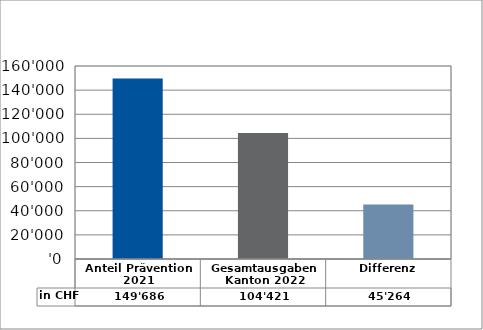
| Category | in CHF |
|---|---|
| Anteil Prävention 2021

 | 149685.6 |
| Gesamtausgaben Kanton 2022
 | 104421.4 |
| Differenz | 45264.2 |